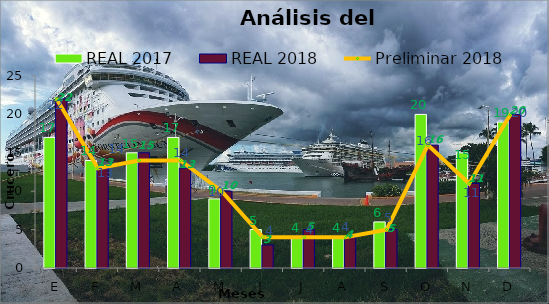
| Category | REAL 2017 | REAL 2018 |
|---|---|---|
| E | 17 | 22 |
| F | 14 | 13 |
| M | 15 | 15 |
| A | 17 | 13 |
| M | 9 | 10 |
| J | 5 | 3 |
| J | 4 | 5 |
| A | 4 | 4 |
| S | 6 | 5 |
| O | 20 | 16 |
| N | 15 | 11 |
| D | 19 | 20 |